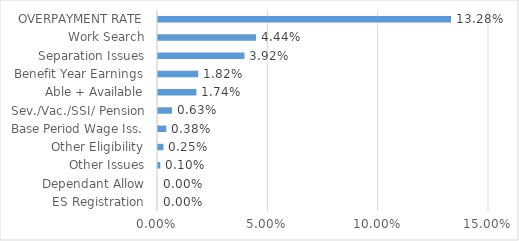
| Category | Series 0 |
|---|---|
| ES Registration | 0 |
| Dependant Allow | 0 |
| Other Issues | 0.001 |
| Other Eligibility | 0.002 |
| Base Period Wage Iss. | 0.004 |
| Sev./Vac./SSI/ Pension | 0.006 |
| Able + Available | 0.017 |
| Benefit Year Earnings | 0.018 |
| Separation Issues | 0.039 |
| Work Search | 0.044 |
| OVERPAYMENT RATE | 0.133 |